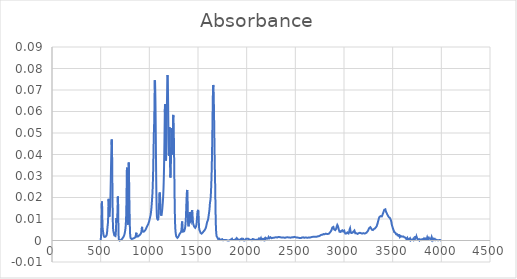
| Category | Absorbance |
|---|---|
| 3997.70514 | 0 |
| 3995.77668 | 0 |
| 3993.84822 | 0 |
| 3991.91975 | 0 |
| 3989.99129 | 0 |
| 3988.06283 | 0 |
| 3986.13436 | 0 |
| 3984.2059 | 0 |
| 3982.27743 | 0 |
| 3980.34897 | 0 |
| 3978.42051 | 0 |
| 3976.49204 | 0 |
| 3974.56358 | 0 |
| 3972.63512 | 0 |
| 3970.70665 | 0 |
| 3968.77819 | 0 |
| 3966.84973 | 0 |
| 3964.92126 | 0 |
| 3962.9928 | 0 |
| 3961.06433 | 0 |
| 3959.13587 | 0 |
| 3957.20741 | 0 |
| 3955.27894 | 0 |
| 3953.35048 | 0 |
| 3951.42202 | 0 |
| 3949.49355 | 0 |
| 3947.56509 | 0 |
| 3945.63663 | 0 |
| 3943.70816 | 0 |
| 3941.7797 | 0 |
| 3939.85123 | 0 |
| 3937.92277 | 0 |
| 3935.99431 | 0 |
| 3934.06584 | 0.001 |
| 3932.13738 | 0.001 |
| 3930.20892 | 0.001 |
| 3928.28045 | 0.001 |
| 3926.35199 | 0.001 |
| 3924.42353 | 0.001 |
| 3922.49506 | 0.001 |
| 3920.5666 | 0.001 |
| 3918.63813 | 0.001 |
| 3916.70967 | 0.001 |
| 3914.78121 | 0.001 |
| 3912.85274 | 0 |
| 3910.92428 | 0 |
| 3908.99582 | 0 |
| 3907.06735 | 0 |
| 3905.13889 | 0.001 |
| 3903.21043 | 0.002 |
| 3901.28196 | 0.002 |
| 3899.3535 | 0.001 |
| 3897.42503 | 0.001 |
| 3895.49657 | 0 |
| 3893.56811 | 0 |
| 3891.63964 | 0.001 |
| 3889.71118 | 0.001 |
| 3887.78272 | 0.001 |
| 3885.85425 | 0.001 |
| 3883.92579 | 0.001 |
| 3881.99733 | 0.001 |
| 3880.06886 | 0.001 |
| 3878.1404 | 0.001 |
| 3876.21193 | 0.001 |
| 3874.28347 | 0.001 |
| 3872.35501 | 0.001 |
| 3870.42654 | 0.001 |
| 3868.49808 | 0.001 |
| 3866.56962 | 0.001 |
| 3864.64115 | 0.001 |
| 3862.71269 | 0.001 |
| 3860.78422 | 0.001 |
| 3858.85576 | 0 |
| 3856.9273 | 0.001 |
| 3854.99883 | 0.001 |
| 3853.07037 | 0.002 |
| 3851.14191 | 0.001 |
| 3849.21344 | 0.001 |
| 3847.28498 | 0 |
| 3845.35652 | 0 |
| 3843.42805 | 0.001 |
| 3841.49959 | 0.001 |
| 3839.57112 | 0.001 |
| 3837.64266 | 0.001 |
| 3835.7142 | 0.001 |
| 3833.78573 | 0.001 |
| 3831.85727 | 0.001 |
| 3829.92881 | 0 |
| 3828.00034 | 0 |
| 3826.07188 | 0.001 |
| 3824.14342 | 0.001 |
| 3822.21495 | 0.001 |
| 3820.28649 | 0.001 |
| 3818.35802 | 0.001 |
| 3816.42956 | 0.001 |
| 3814.5011 | 0 |
| 3812.57263 | 0 |
| 3810.64417 | 0 |
| 3808.71571 | 0 |
| 3806.78724 | 0 |
| 3804.85878 | 0 |
| 3802.93032 | 0.001 |
| 3801.00185 | 0.001 |
| 3799.07339 | 0.001 |
| 3797.14492 | 0.001 |
| 3795.21646 | 0.001 |
| 3793.288 | 0 |
| 3791.35953 | 0 |
| 3789.43107 | 0 |
| 3787.50261 | 0 |
| 3785.57414 | 0 |
| 3783.64568 | 0 |
| 3781.71722 | 0 |
| 3779.78875 | 0.001 |
| 3777.86029 | 0 |
| 3775.93182 | 0 |
| 3774.00336 | 0 |
| 3772.0749 | 0 |
| 3770.14643 | 0 |
| 3768.21797 | 0 |
| 3766.28951 | 0.001 |
| 3764.36104 | 0 |
| 3762.43258 | 0 |
| 3760.50412 | 0.001 |
| 3758.57565 | 0.001 |
| 3756.64719 | 0.001 |
| 3754.71872 | 0.001 |
| 3752.79026 | 0.001 |
| 3750.8618 | 0.001 |
| 3748.93333 | 0.001 |
| 3747.00487 | 0.002 |
| 3745.07641 | 0.002 |
| 3743.14794 | 0.002 |
| 3741.21948 | 0.001 |
| 3739.29102 | 0.001 |
| 3737.36255 | 0.001 |
| 3735.43409 | 0.002 |
| 3733.50562 | 0.002 |
| 3731.57716 | 0.001 |
| 3729.6487 | 0.001 |
| 3727.72023 | 0.001 |
| 3725.79177 | 0.001 |
| 3723.86331 | 0.001 |
| 3721.93484 | 0.001 |
| 3720.00638 | 0 |
| 3718.07791 | 0 |
| 3716.14945 | 0 |
| 3714.22099 | 0 |
| 3712.29252 | 0.001 |
| 3710.36406 | 0.001 |
| 3708.4356 | 0.001 |
| 3706.50713 | 0 |
| 3704.57867 | 0 |
| 3702.65021 | 0 |
| 3700.72174 | 0.001 |
| 3698.79328 | 0 |
| 3696.86481 | 0 |
| 3694.93635 | 0 |
| 3693.00789 | 0.001 |
| 3691.07942 | 0.001 |
| 3689.15096 | 0.001 |
| 3687.2225 | 0.001 |
| 3685.29403 | 0 |
| 3683.36557 | 0 |
| 3681.43711 | 0 |
| 3679.50864 | 0.001 |
| 3677.58018 | 0.001 |
| 3675.65171 | 0.001 |
| 3673.72325 | 0.001 |
| 3671.79479 | 0.001 |
| 3669.86632 | 0.001 |
| 3667.93786 | 0.001 |
| 3666.0094 | 0.001 |
| 3664.08093 | 0 |
| 3662.15247 | 0 |
| 3660.22401 | 0 |
| 3658.29554 | 0 |
| 3656.36708 | 0 |
| 3654.43861 | 0 |
| 3652.51015 | 0.001 |
| 3650.58169 | 0.001 |
| 3648.65322 | 0.002 |
| 3646.72476 | 0.001 |
| 3644.7963 | 0.001 |
| 3642.86783 | 0.001 |
| 3640.93937 | 0.001 |
| 3639.01091 | 0 |
| 3637.08244 | 0 |
| 3635.15398 | 0.001 |
| 3633.22551 | 0.001 |
| 3631.29705 | 0.001 |
| 3629.36859 | 0.002 |
| 3627.44012 | 0.002 |
| 3625.51166 | 0.001 |
| 3623.5832 | 0.001 |
| 3621.65473 | 0.001 |
| 3619.72627 | 0.002 |
| 3617.79781 | 0.002 |
| 3615.86934 | 0.002 |
| 3613.94088 | 0.002 |
| 3612.01241 | 0.002 |
| 3610.08395 | 0.002 |
| 3608.15549 | 0.002 |
| 3606.22702 | 0.002 |
| 3604.29856 | 0.002 |
| 3602.3701 | 0.002 |
| 3600.44163 | 0.002 |
| 3598.51317 | 0.002 |
| 3596.58471 | 0.002 |
| 3594.65624 | 0.002 |
| 3592.72778 | 0.002 |
| 3590.79931 | 0.002 |
| 3588.87085 | 0.002 |
| 3586.94239 | 0.002 |
| 3585.01392 | 0.002 |
| 3583.08546 | 0.002 |
| 3581.157 | 0.002 |
| 3579.22853 | 0.002 |
| 3577.30007 | 0.002 |
| 3575.3716 | 0.002 |
| 3573.44314 | 0.002 |
| 3571.51468 | 0.002 |
| 3569.58621 | 0.002 |
| 3567.65775 | 0.003 |
| 3565.72929 | 0.003 |
| 3563.80082 | 0.003 |
| 3561.87236 | 0.002 |
| 3559.9439 | 0.002 |
| 3558.01543 | 0.002 |
| 3556.08697 | 0.002 |
| 3554.1585 | 0.002 |
| 3552.23004 | 0.002 |
| 3550.30158 | 0.002 |
| 3548.37311 | 0.003 |
| 3546.44465 | 0.003 |
| 3544.51619 | 0.003 |
| 3542.58772 | 0.003 |
| 3540.65926 | 0.003 |
| 3538.7308 | 0.003 |
| 3536.80233 | 0.003 |
| 3534.87387 | 0.003 |
| 3532.9454 | 0.003 |
| 3531.01694 | 0.003 |
| 3529.08848 | 0.003 |
| 3527.16001 | 0.004 |
| 3525.23155 | 0.004 |
| 3523.30309 | 0.004 |
| 3521.37462 | 0.004 |
| 3519.44616 | 0.004 |
| 3517.5177 | 0.004 |
| 3515.58923 | 0.004 |
| 3513.66077 | 0.004 |
| 3511.7323 | 0.005 |
| 3509.80384 | 0.005 |
| 3507.87538 | 0.005 |
| 3505.94691 | 0.005 |
| 3504.01845 | 0.005 |
| 3502.08999 | 0.006 |
| 3500.16152 | 0.006 |
| 3498.23306 | 0.006 |
| 3496.3046 | 0.007 |
| 3494.37613 | 0.007 |
| 3492.44767 | 0.007 |
| 3490.5192 | 0.008 |
| 3488.59074 | 0.008 |
| 3486.66228 | 0.009 |
| 3484.73381 | 0.009 |
| 3482.80535 | 0.009 |
| 3480.87689 | 0.01 |
| 3478.94842 | 0.01 |
| 3477.01996 | 0.01 |
| 3475.0915 | 0.01 |
| 3473.16303 | 0.01 |
| 3471.23457 | 0.011 |
| 3469.3061 | 0.011 |
| 3467.37764 | 0.011 |
| 3465.44918 | 0.011 |
| 3463.52071 | 0.011 |
| 3461.59225 | 0.011 |
| 3459.66379 | 0.011 |
| 3457.73532 | 0.011 |
| 3455.80686 | 0.011 |
| 3453.8784 | 0.011 |
| 3451.94993 | 0.011 |
| 3450.02147 | 0.012 |
| 3448.093 | 0.012 |
| 3446.16454 | 0.012 |
| 3444.23608 | 0.012 |
| 3442.30761 | 0.012 |
| 3440.37915 | 0.013 |
| 3438.45069 | 0.013 |
| 3436.52222 | 0.013 |
| 3434.59376 | 0.013 |
| 3432.66529 | 0.013 |
| 3430.73683 | 0.014 |
| 3428.80837 | 0.014 |
| 3426.8799 | 0.014 |
| 3424.95144 | 0.015 |
| 3423.02298 | 0.015 |
| 3421.09451 | 0.015 |
| 3419.16605 | 0.015 |
| 3417.23759 | 0.015 |
| 3415.30912 | 0.014 |
| 3413.38066 | 0.014 |
| 3411.45219 | 0.014 |
| 3409.52373 | 0.014 |
| 3407.59527 | 0.013 |
| 3405.6668 | 0.013 |
| 3403.73834 | 0.013 |
| 3401.80988 | 0.013 |
| 3399.88141 | 0.012 |
| 3397.95295 | 0.012 |
| 3396.02449 | 0.012 |
| 3394.09602 | 0.012 |
| 3392.16756 | 0.012 |
| 3390.23909 | 0.011 |
| 3388.31063 | 0.011 |
| 3386.38217 | 0.011 |
| 3384.4537 | 0.011 |
| 3382.52524 | 0.011 |
| 3380.59678 | 0.011 |
| 3378.66831 | 0.011 |
| 3376.73985 | 0.011 |
| 3374.81139 | 0.011 |
| 3372.88292 | 0.011 |
| 3370.95446 | 0.011 |
| 3369.02599 | 0.011 |
| 3367.09753 | 0.011 |
| 3365.16907 | 0.011 |
| 3363.2406 | 0.011 |
| 3361.31214 | 0.011 |
| 3359.38368 | 0.011 |
| 3357.45521 | 0.01 |
| 3355.52675 | 0.01 |
| 3353.59829 | 0.009 |
| 3351.66982 | 0.009 |
| 3349.74136 | 0.009 |
| 3347.81289 | 0.008 |
| 3345.88443 | 0.008 |
| 3343.95597 | 0.008 |
| 3342.0275 | 0.008 |
| 3340.09904 | 0.007 |
| 3338.17058 | 0.007 |
| 3336.24211 | 0.007 |
| 3334.31365 | 0.007 |
| 3332.38519 | 0.006 |
| 3330.45672 | 0.006 |
| 3328.52826 | 0.006 |
| 3326.59979 | 0.006 |
| 3324.67133 | 0.006 |
| 3322.74287 | 0.006 |
| 3320.8144 | 0.006 |
| 3318.88594 | 0.006 |
| 3316.95748 | 0.006 |
| 3315.02901 | 0.006 |
| 3313.10055 | 0.006 |
| 3311.17208 | 0.006 |
| 3309.24362 | 0.006 |
| 3307.31516 | 0.005 |
| 3305.38669 | 0.005 |
| 3303.45823 | 0.005 |
| 3301.52977 | 0.005 |
| 3299.6013 | 0.005 |
| 3297.67284 | 0.005 |
| 3295.74438 | 0.005 |
| 3293.81591 | 0.005 |
| 3291.88745 | 0.005 |
| 3289.95898 | 0.005 |
| 3288.03052 | 0.005 |
| 3286.10206 | 0.005 |
| 3284.17359 | 0.005 |
| 3282.24513 | 0.005 |
| 3280.31667 | 0.006 |
| 3278.3882 | 0.006 |
| 3276.45974 | 0.006 |
| 3274.53128 | 0.006 |
| 3272.60281 | 0.006 |
| 3270.67435 | 0.006 |
| 3268.74588 | 0.006 |
| 3266.81742 | 0.006 |
| 3264.88896 | 0.006 |
| 3262.96049 | 0.006 |
| 3261.03203 | 0.006 |
| 3259.10357 | 0.006 |
| 3257.1751 | 0.006 |
| 3255.24664 | 0.005 |
| 3253.31818 | 0.005 |
| 3251.38971 | 0.005 |
| 3249.46125 | 0.005 |
| 3247.53278 | 0.005 |
| 3245.60432 | 0.004 |
| 3243.67586 | 0.004 |
| 3241.74739 | 0.004 |
| 3239.81893 | 0.004 |
| 3237.89047 | 0.004 |
| 3235.962 | 0.004 |
| 3234.03354 | 0.004 |
| 3232.10508 | 0.004 |
| 3230.17661 | 0.004 |
| 3228.24815 | 0.004 |
| 3226.31968 | 0.004 |
| 3224.39122 | 0.003 |
| 3222.46276 | 0.003 |
| 3220.53429 | 0.003 |
| 3218.60583 | 0.003 |
| 3216.67737 | 0.003 |
| 3214.7489 | 0.003 |
| 3212.82044 | 0.003 |
| 3210.89198 | 0.003 |
| 3208.96351 | 0.003 |
| 3207.03505 | 0.003 |
| 3205.10658 | 0.003 |
| 3203.17812 | 0.003 |
| 3201.24966 | 0.003 |
| 3199.32119 | 0.003 |
| 3197.39273 | 0.003 |
| 3195.46427 | 0.003 |
| 3193.5358 | 0.003 |
| 3191.60734 | 0.003 |
| 3189.67888 | 0.003 |
| 3187.75041 | 0.003 |
| 3185.82195 | 0.003 |
| 3183.89348 | 0.003 |
| 3181.96502 | 0.003 |
| 3180.03656 | 0.003 |
| 3178.10809 | 0.003 |
| 3176.17963 | 0.003 |
| 3174.25117 | 0.003 |
| 3172.3227 | 0.004 |
| 3170.39424 | 0.004 |
| 3168.46577 | 0.004 |
| 3166.53731 | 0.004 |
| 3164.60885 | 0.004 |
| 3162.68038 | 0.004 |
| 3160.75192 | 0.003 |
| 3158.82346 | 0.003 |
| 3156.89499 | 0.003 |
| 3154.96653 | 0.003 |
| 3153.03807 | 0.003 |
| 3151.1096 | 0.003 |
| 3149.18114 | 0.003 |
| 3147.25267 | 0.003 |
| 3145.32421 | 0.003 |
| 3143.39575 | 0.003 |
| 3141.46728 | 0.003 |
| 3139.53882 | 0.003 |
| 3137.61036 | 0.003 |
| 3135.68189 | 0.003 |
| 3133.75343 | 0.003 |
| 3131.82497 | 0.003 |
| 3129.8965 | 0.003 |
| 3127.96804 | 0.003 |
| 3126.03957 | 0.004 |
| 3124.11111 | 0.003 |
| 3122.18265 | 0.003 |
| 3120.25418 | 0.003 |
| 3118.32572 | 0.003 |
| 3116.39726 | 0.003 |
| 3114.46879 | 0.003 |
| 3112.54033 | 0.004 |
| 3110.61187 | 0.004 |
| 3108.6834 | 0.004 |
| 3106.75494 | 0.005 |
| 3104.82647 | 0.005 |
| 3102.89801 | 0.005 |
| 3100.96955 | 0.005 |
| 3099.04108 | 0.004 |
| 3097.11262 | 0.004 |
| 3095.18416 | 0.004 |
| 3093.25569 | 0.004 |
| 3091.32723 | 0.004 |
| 3089.39877 | 0.004 |
| 3087.4703 | 0.004 |
| 3085.54184 | 0.004 |
| 3083.61337 | 0.003 |
| 3081.68491 | 0.003 |
| 3079.75645 | 0.003 |
| 3077.82798 | 0.003 |
| 3075.89952 | 0.003 |
| 3073.97106 | 0.003 |
| 3072.04259 | 0.004 |
| 3070.11413 | 0.004 |
| 3068.18567 | 0.004 |
| 3066.2572 | 0.005 |
| 3064.32874 | 0.005 |
| 3062.40027 | 0.006 |
| 3060.47181 | 0.006 |
| 3058.54335 | 0.006 |
| 3056.61488 | 0.005 |
| 3054.68642 | 0.004 |
| 3052.75796 | 0.004 |
| 3050.82949 | 0.004 |
| 3048.90103 | 0.003 |
| 3046.97257 | 0.003 |
| 3045.0441 | 0.003 |
| 3043.11564 | 0.003 |
| 3041.18717 | 0.003 |
| 3039.25871 | 0.003 |
| 3037.33025 | 0.004 |
| 3035.40178 | 0.004 |
| 3033.47332 | 0.004 |
| 3031.54486 | 0.004 |
| 3029.61639 | 0.004 |
| 3027.68793 | 0.003 |
| 3025.75946 | 0.003 |
| 3023.831 | 0.003 |
| 3021.90254 | 0.003 |
| 3019.97407 | 0.003 |
| 3018.04561 | 0.003 |
| 3016.11715 | 0.003 |
| 3014.18868 | 0.003 |
| 3012.26022 | 0.003 |
| 3010.33176 | 0.003 |
| 3008.40329 | 0.003 |
| 3006.47483 | 0.004 |
| 3004.54636 | 0.004 |
| 3002.6179 | 0.005 |
| 3000.68944 | 0.005 |
| 2998.76097 | 0.005 |
| 2996.83251 | 0.005 |
| 2994.90405 | 0.005 |
| 2992.97558 | 0.004 |
| 2991.04712 | 0.004 |
| 2989.11866 | 0.004 |
| 2987.19019 | 0.004 |
| 2985.26173 | 0.005 |
| 2983.33326 | 0.005 |
| 2981.4048 | 0.005 |
| 2979.47634 | 0.005 |
| 2977.54787 | 0.005 |
| 2975.61941 | 0.005 |
| 2973.69095 | 0.005 |
| 2971.76248 | 0.004 |
| 2969.83402 | 0.004 |
| 2967.90556 | 0.004 |
| 2965.97709 | 0.004 |
| 2964.04863 | 0.004 |
| 2962.12016 | 0.004 |
| 2960.1917 | 0.004 |
| 2958.26324 | 0.004 |
| 2956.33477 | 0.004 |
| 2954.40631 | 0.004 |
| 2952.47785 | 0.004 |
| 2950.54938 | 0.004 |
| 2948.62092 | 0.005 |
| 2946.69246 | 0.005 |
| 2944.76399 | 0.005 |
| 2942.83553 | 0.006 |
| 2940.90706 | 0.006 |
| 2938.9786 | 0.006 |
| 2937.05014 | 0.007 |
| 2935.12167 | 0.007 |
| 2933.19321 | 0.007 |
| 2931.26475 | 0.007 |
| 2929.33628 | 0.007 |
| 2927.40782 | 0.007 |
| 2925.47936 | 0.007 |
| 2923.55089 | 0.006 |
| 2921.62243 | 0.006 |
| 2919.69396 | 0.006 |
| 2917.7655 | 0.005 |
| 2915.83704 | 0.005 |
| 2913.90857 | 0.005 |
| 2911.98011 | 0.005 |
| 2910.05165 | 0.005 |
| 2908.12318 | 0.005 |
| 2906.19472 | 0.005 |
| 2904.26626 | 0.005 |
| 2902.33779 | 0.005 |
| 2900.40933 | 0.005 |
| 2898.48086 | 0.005 |
| 2896.5524 | 0.005 |
| 2894.62394 | 0.006 |
| 2892.69547 | 0.006 |
| 2890.76701 | 0.006 |
| 2888.83855 | 0.006 |
| 2886.91008 | 0.007 |
| 2884.98162 | 0.007 |
| 2883.05315 | 0.007 |
| 2881.12469 | 0.006 |
| 2879.19623 | 0.006 |
| 2877.26776 | 0.006 |
| 2875.3393 | 0.005 |
| 2873.41084 | 0.005 |
| 2871.48237 | 0.005 |
| 2869.55391 | 0.005 |
| 2867.62545 | 0.004 |
| 2865.69698 | 0.004 |
| 2863.76852 | 0.004 |
| 2861.84005 | 0.004 |
| 2859.91159 | 0.004 |
| 2857.98313 | 0.004 |
| 2856.05466 | 0.004 |
| 2854.1262 | 0.004 |
| 2852.19774 | 0.004 |
| 2850.26927 | 0.003 |
| 2848.34081 | 0.003 |
| 2846.41235 | 0.003 |
| 2844.48388 | 0.003 |
| 2842.55542 | 0.003 |
| 2840.62695 | 0.003 |
| 2838.69849 | 0.003 |
| 2836.77003 | 0.003 |
| 2834.84156 | 0.003 |
| 2832.9131 | 0.003 |
| 2830.98464 | 0.003 |
| 2829.05617 | 0.003 |
| 2827.12771 | 0.003 |
| 2825.19925 | 0.003 |
| 2823.27078 | 0.003 |
| 2821.34232 | 0.003 |
| 2819.41385 | 0.003 |
| 2817.48539 | 0.003 |
| 2815.55693 | 0.003 |
| 2813.62846 | 0.003 |
| 2811.7 | 0.003 |
| 2809.77154 | 0.003 |
| 2807.84307 | 0.003 |
| 2805.91461 | 0.003 |
| 2803.98615 | 0.003 |
| 2802.05768 | 0.003 |
| 2800.12922 | 0.003 |
| 2798.20075 | 0.003 |
| 2796.27229 | 0.003 |
| 2794.34383 | 0.003 |
| 2792.41536 | 0.003 |
| 2790.4869 | 0.003 |
| 2788.55844 | 0.003 |
| 2786.62997 | 0.003 |
| 2784.70151 | 0.003 |
| 2782.77305 | 0.003 |
| 2780.84458 | 0.003 |
| 2778.91612 | 0.003 |
| 2776.98765 | 0.003 |
| 2775.05919 | 0.003 |
| 2773.13073 | 0.003 |
| 2771.20226 | 0.003 |
| 2769.2738 | 0.003 |
| 2767.34534 | 0.003 |
| 2765.41687 | 0.003 |
| 2763.48841 | 0.003 |
| 2761.55995 | 0.003 |
| 2759.63148 | 0.002 |
| 2757.70302 | 0.002 |
| 2755.77455 | 0.002 |
| 2753.84609 | 0.002 |
| 2751.91763 | 0.002 |
| 2749.98916 | 0.002 |
| 2748.0607 | 0.002 |
| 2746.13224 | 0.002 |
| 2744.20377 | 0.002 |
| 2742.27531 | 0.002 |
| 2740.34684 | 0.002 |
| 2738.41838 | 0.002 |
| 2736.48992 | 0.002 |
| 2734.56145 | 0.002 |
| 2732.63299 | 0.002 |
| 2730.70453 | 0.002 |
| 2728.77606 | 0.002 |
| 2726.8476 | 0.002 |
| 2724.91914 | 0.002 |
| 2722.99067 | 0.002 |
| 2721.06221 | 0.002 |
| 2719.13374 | 0.002 |
| 2717.20528 | 0.002 |
| 2715.27682 | 0.002 |
| 2713.34835 | 0.002 |
| 2711.41989 | 0.002 |
| 2709.49143 | 0.002 |
| 2707.56296 | 0.002 |
| 2705.6345 | 0.002 |
| 2703.70604 | 0.002 |
| 2701.77757 | 0.002 |
| 2699.84911 | 0.002 |
| 2697.92064 | 0.002 |
| 2695.99218 | 0.002 |
| 2694.06372 | 0.002 |
| 2692.13525 | 0.002 |
| 2690.20679 | 0.002 |
| 2688.27833 | 0.002 |
| 2686.34986 | 0.002 |
| 2684.4214 | 0.002 |
| 2682.49294 | 0.002 |
| 2680.56447 | 0.002 |
| 2678.63601 | 0.002 |
| 2676.70754 | 0.002 |
| 2674.77908 | 0.002 |
| 2672.85062 | 0.002 |
| 2670.92215 | 0.002 |
| 2668.99369 | 0.002 |
| 2667.06523 | 0.002 |
| 2665.13676 | 0.002 |
| 2663.2083 | 0.002 |
| 2661.27984 | 0.002 |
| 2659.35137 | 0.001 |
| 2657.42291 | 0.001 |
| 2655.49444 | 0.001 |
| 2653.56598 | 0.001 |
| 2651.63752 | 0.001 |
| 2649.70905 | 0.001 |
| 2647.78059 | 0.001 |
| 2645.85213 | 0.001 |
| 2643.92366 | 0.002 |
| 2641.9952 | 0.002 |
| 2640.06674 | 0.001 |
| 2638.13827 | 0.001 |
| 2636.20981 | 0.001 |
| 2634.28134 | 0.001 |
| 2632.35288 | 0.001 |
| 2630.42442 | 0.001 |
| 2628.49595 | 0.001 |
| 2626.56749 | 0.001 |
| 2624.63903 | 0.001 |
| 2622.71056 | 0.001 |
| 2620.7821 | 0.001 |
| 2618.85364 | 0.001 |
| 2616.92517 | 0.001 |
| 2614.99671 | 0.001 |
| 2613.06824 | 0.001 |
| 2611.13978 | 0.001 |
| 2609.21132 | 0.001 |
| 2607.28285 | 0.001 |
| 2605.35439 | 0.001 |
| 2603.42593 | 0.001 |
| 2601.49746 | 0.001 |
| 2599.569 | 0.001 |
| 2597.64053 | 0.001 |
| 2595.71207 | 0.001 |
| 2593.78361 | 0.001 |
| 2591.85514 | 0.001 |
| 2589.92668 | 0.001 |
| 2587.99822 | 0.001 |
| 2586.06975 | 0.001 |
| 2584.14129 | 0.001 |
| 2582.21283 | 0.001 |
| 2580.28436 | 0.001 |
| 2578.3559 | 0.002 |
| 2576.42743 | 0.002 |
| 2574.49897 | 0.001 |
| 2572.57051 | 0.001 |
| 2570.64204 | 0.001 |
| 2568.71358 | 0.001 |
| 2566.78512 | 0.001 |
| 2564.85665 | 0.001 |
| 2562.92819 | 0.001 |
| 2560.99973 | 0.001 |
| 2559.07126 | 0.001 |
| 2557.1428 | 0.001 |
| 2555.21433 | 0.001 |
| 2553.28587 | 0.001 |
| 2551.35741 | 0.001 |
| 2549.42894 | 0.001 |
| 2547.50048 | 0.001 |
| 2545.57202 | 0.001 |
| 2543.64355 | 0.001 |
| 2541.71509 | 0.001 |
| 2539.78663 | 0.001 |
| 2537.85816 | 0.001 |
| 2535.9297 | 0.001 |
| 2534.00123 | 0.001 |
| 2532.07277 | 0.001 |
| 2530.14431 | 0.001 |
| 2528.21584 | 0.002 |
| 2526.28738 | 0.002 |
| 2524.35892 | 0.001 |
| 2522.43045 | 0.001 |
| 2520.50199 | 0.001 |
| 2518.57353 | 0.001 |
| 2516.64506 | 0.001 |
| 2514.7166 | 0.001 |
| 2512.78813 | 0.001 |
| 2510.85967 | 0.001 |
| 2508.93121 | 0.002 |
| 2507.00274 | 0.002 |
| 2505.07428 | 0.002 |
| 2503.14582 | 0.002 |
| 2501.21735 | 0.002 |
| 2499.28889 | 0.002 |
| 2497.36043 | 0.002 |
| 2495.43196 | 0.002 |
| 2493.5035 | 0.002 |
| 2491.57503 | 0.002 |
| 2489.64657 | 0.002 |
| 2487.71811 | 0.002 |
| 2485.78964 | 0.002 |
| 2483.86118 | 0.002 |
| 2481.93272 | 0.002 |
| 2480.00425 | 0.001 |
| 2478.07579 | 0.001 |
| 2476.14733 | 0.001 |
| 2474.21886 | 0.002 |
| 2472.2904 | 0.002 |
| 2470.36193 | 0.002 |
| 2468.43347 | 0.002 |
| 2466.50501 | 0.001 |
| 2464.57654 | 0.001 |
| 2462.64808 | 0.001 |
| 2460.71962 | 0.001 |
| 2458.79115 | 0.001 |
| 2456.86269 | 0.001 |
| 2454.93422 | 0.001 |
| 2453.00576 | 0.001 |
| 2451.0773 | 0.001 |
| 2449.14883 | 0.001 |
| 2447.22037 | 0.002 |
| 2445.29191 | 0.001 |
| 2443.36344 | 0.001 |
| 2441.43498 | 0.001 |
| 2439.50652 | 0.001 |
| 2437.57805 | 0.001 |
| 2435.64959 | 0.001 |
| 2433.72112 | 0.001 |
| 2431.79266 | 0.001 |
| 2429.8642 | 0.001 |
| 2427.93573 | 0.001 |
| 2426.00727 | 0.001 |
| 2424.07881 | 0.001 |
| 2422.15034 | 0.001 |
| 2420.22188 | 0.001 |
| 2418.29342 | 0.001 |
| 2416.36495 | 0.001 |
| 2414.43649 | 0.001 |
| 2412.50802 | 0.001 |
| 2410.57956 | 0.002 |
| 2408.6511 | 0.002 |
| 2406.72263 | 0.001 |
| 2404.79417 | 0.001 |
| 2402.86571 | 0.001 |
| 2400.93724 | 0.001 |
| 2399.00878 | 0.001 |
| 2397.08032 | 0.001 |
| 2395.15185 | 0.001 |
| 2393.22339 | 0.001 |
| 2391.29492 | 0.001 |
| 2389.36646 | 0.001 |
| 2387.438 | 0.001 |
| 2385.50953 | 0.001 |
| 2383.58107 | 0.001 |
| 2381.65261 | 0.001 |
| 2379.72414 | 0.001 |
| 2377.79568 | 0.001 |
| 2375.86722 | 0.002 |
| 2373.93875 | 0.001 |
| 2372.01029 | 0.001 |
| 2370.08182 | 0.001 |
| 2368.15336 | 0.001 |
| 2366.2249 | 0.001 |
| 2364.29643 | 0.001 |
| 2362.36797 | 0.001 |
| 2360.43951 | 0.001 |
| 2358.51104 | 0.001 |
| 2356.58258 | 0.001 |
| 2354.65412 | 0.002 |
| 2352.72565 | 0.002 |
| 2350.79719 | 0.001 |
| 2348.86872 | 0.001 |
| 2346.94026 | 0.001 |
| 2345.0118 | 0.001 |
| 2343.08333 | 0.001 |
| 2341.15487 | 0.001 |
| 2339.22641 | 0.002 |
| 2337.29794 | 0.002 |
| 2335.36948 | 0.002 |
| 2333.44102 | 0.002 |
| 2331.51255 | 0.002 |
| 2329.58409 | 0.002 |
| 2327.65562 | 0.002 |
| 2325.72716 | 0.002 |
| 2323.7987 | 0.002 |
| 2321.87023 | 0.002 |
| 2319.94177 | 0.002 |
| 2318.01331 | 0.002 |
| 2316.08484 | 0.001 |
| 2314.15638 | 0.001 |
| 2312.22791 | 0.001 |
| 2310.29945 | 0.001 |
| 2308.37099 | 0.002 |
| 2306.44252 | 0.002 |
| 2304.51406 | 0.002 |
| 2302.5856 | 0.002 |
| 2300.65713 | 0.001 |
| 2298.72867 | 0.001 |
| 2296.80021 | 0.001 |
| 2294.87174 | 0.001 |
| 2292.94328 | 0.001 |
| 2291.01481 | 0.001 |
| 2289.08635 | 0.001 |
| 2287.15789 | 0.001 |
| 2285.22942 | 0.001 |
| 2283.30096 | 0.001 |
| 2281.3725 | 0.001 |
| 2279.44403 | 0.001 |
| 2277.51557 | 0.001 |
| 2275.58711 | 0.001 |
| 2273.65864 | 0.001 |
| 2271.73018 | 0.001 |
| 2269.80171 | 0.001 |
| 2267.87325 | 0.001 |
| 2265.94479 | 0.001 |
| 2264.01632 | 0.001 |
| 2262.08786 | 0.001 |
| 2260.1594 | 0.001 |
| 2258.23093 | 0.001 |
| 2256.30247 | 0.001 |
| 2254.37401 | 0.001 |
| 2252.44554 | 0.001 |
| 2250.51708 | 0.001 |
| 2248.58861 | 0.001 |
| 2246.66015 | 0.001 |
| 2244.73169 | 0.002 |
| 2242.80322 | 0.001 |
| 2240.87476 | 0.001 |
| 2238.9463 | 0.001 |
| 2237.01783 | 0.001 |
| 2235.08937 | 0.001 |
| 2233.16091 | 0.001 |
| 2231.23244 | 0.001 |
| 2229.30398 | 0.001 |
| 2227.37551 | 0.001 |
| 2225.44705 | 0.002 |
| 2223.51859 | 0.001 |
| 2221.59012 | 0.001 |
| 2219.66166 | 0.001 |
| 2217.7332 | 0.001 |
| 2215.80473 | 0.001 |
| 2213.87627 | 0.001 |
| 2211.94781 | 0.001 |
| 2210.01934 | 0.001 |
| 2208.09088 | 0.001 |
| 2206.16241 | 0.001 |
| 2204.23395 | 0.001 |
| 2202.30549 | 0.001 |
| 2200.37702 | 0.001 |
| 2198.44856 | 0.001 |
| 2196.5201 | 0.001 |
| 2194.59163 | 0.001 |
| 2192.66317 | 0.001 |
| 2190.73471 | 0.001 |
| 2188.80624 | 0.001 |
| 2186.87778 | 0.001 |
| 2184.94931 | 0.001 |
| 2183.02085 | 0.001 |
| 2181.09239 | 0.001 |
| 2179.16392 | 0.001 |
| 2177.23546 | 0.001 |
| 2175.307 | 0 |
| 2173.37853 | 0 |
| 2171.45007 | 0 |
| 2169.5216 | 0 |
| 2167.59314 | 0 |
| 2165.66468 | 0.001 |
| 2163.73621 | 0.001 |
| 2161.80775 | 0.001 |
| 2159.87929 | 0.001 |
| 2157.95082 | 0.001 |
| 2156.02236 | 0.001 |
| 2154.0939 | 0.001 |
| 2152.16543 | 0 |
| 2150.23697 | 0 |
| 2148.3085 | 0.001 |
| 2146.38004 | 0.001 |
| 2144.45158 | 0.001 |
| 2142.52311 | 0.001 |
| 2140.59465 | 0.001 |
| 2138.66619 | 0.001 |
| 2136.73772 | 0.001 |
| 2134.80926 | 0.001 |
| 2132.8808 | 0.001 |
| 2130.95233 | 0.001 |
| 2129.02387 | 0.001 |
| 2127.0954 | 0.001 |
| 2125.16694 | 0.001 |
| 2123.23848 | 0.001 |
| 2121.31001 | 0.001 |
| 2119.38155 | 0.001 |
| 2117.45309 | 0 |
| 2115.52462 | 0 |
| 2113.59616 | 0.001 |
| 2111.6677 | 0.001 |
| 2109.73923 | 0.001 |
| 2107.81077 | 0.001 |
| 2105.8823 | 0 |
| 2103.95384 | 0 |
| 2102.02538 | 0 |
| 2100.09691 | 0 |
| 2098.16845 | 0 |
| 2096.23999 | 0 |
| 2094.31152 | 0 |
| 2092.38306 | 0 |
| 2090.4546 | 0 |
| 2088.52613 | 0 |
| 2086.59767 | 0.001 |
| 2084.6692 | 0.001 |
| 2082.74074 | 0 |
| 2080.81228 | 0 |
| 2078.88381 | 0 |
| 2076.95535 | 0 |
| 2075.02689 | 0 |
| 2073.09842 | 0.001 |
| 2071.16996 | 0.001 |
| 2069.2415 | 0.001 |
| 2067.31303 | 0.001 |
| 2065.38457 | 0.001 |
| 2063.4561 | 0 |
| 2061.52764 | 0 |
| 2059.59918 | 0.001 |
| 2057.67071 | 0.001 |
| 2055.74225 | 0.001 |
| 2053.81379 | 0 |
| 2051.88532 | 0 |
| 2049.95686 | 0 |
| 2048.0284 | 0 |
| 2046.09993 | 0 |
| 2044.17147 | 0 |
| 2042.243 | 0 |
| 2040.31454 | 0 |
| 2038.38608 | 0 |
| 2036.45761 | 0 |
| 2034.52915 | 0 |
| 2032.60069 | 0 |
| 2030.67222 | 0 |
| 2028.74376 | 0 |
| 2026.81529 | 0.001 |
| 2024.88683 | 0.001 |
| 2022.95837 | 0.001 |
| 2021.0299 | 0.001 |
| 2019.10144 | 0.001 |
| 2017.17298 | 0.001 |
| 2015.24451 | 0.001 |
| 2013.31605 | 0.001 |
| 2011.38759 | 0.001 |
| 2009.45912 | 0.001 |
| 2007.53066 | 0.001 |
| 2005.60219 | 0.001 |
| 2003.67373 | 0.001 |
| 2001.74527 | 0.001 |
| 1999.8168 | 0.001 |
| 1997.88834 | 0.001 |
| 1995.95988 | 0.001 |
| 1994.03141 | 0.001 |
| 1992.10295 | 0.001 |
| 1990.17449 | 0.001 |
| 1988.24602 | 0.001 |
| 1986.31756 | 0 |
| 1984.38909 | 0 |
| 1982.46063 | 0 |
| 1980.53217 | 0 |
| 1978.6037 | 0 |
| 1976.67524 | 0 |
| 1974.74678 | 0 |
| 1972.81831 | 0 |
| 1970.88985 | 0 |
| 1968.96139 | 0 |
| 1967.03292 | 0.001 |
| 1965.10446 | 0.001 |
| 1963.17599 | 0.001 |
| 1961.24753 | 0 |
| 1959.31907 | 0 |
| 1957.3906 | 0 |
| 1955.46214 | 0 |
| 1953.53368 | 0.001 |
| 1951.60521 | 0.001 |
| 1949.67675 | 0.001 |
| 1947.74829 | 0.001 |
| 1945.81982 | 0.001 |
| 1943.89136 | 0.001 |
| 1941.96289 | 0.001 |
| 1940.03443 | 0.001 |
| 1938.10597 | 0.001 |
| 1936.1775 | 0.001 |
| 1934.24904 | 0.001 |
| 1932.32058 | 0.001 |
| 1930.39211 | 0 |
| 1928.46365 | 0 |
| 1926.53519 | 0 |
| 1924.60672 | 0 |
| 1922.67826 | 0 |
| 1920.74979 | 0.001 |
| 1918.82133 | 0.001 |
| 1916.89287 | 0 |
| 1914.9644 | 0 |
| 1913.03594 | 0 |
| 1911.10748 | 0 |
| 1909.17901 | 0 |
| 1907.25055 | 0.001 |
| 1905.32209 | 0.001 |
| 1903.39362 | 0.001 |
| 1901.46516 | 0.001 |
| 1899.53669 | 0.001 |
| 1897.60823 | 0.001 |
| 1895.67977 | 0.001 |
| 1893.7513 | 0.001 |
| 1891.82284 | 0.001 |
| 1889.89438 | 0.001 |
| 1887.96591 | 0.001 |
| 1886.03745 | 0 |
| 1884.10898 | 0 |
| 1882.18052 | 0 |
| 1880.25206 | 0 |
| 1878.32359 | 0 |
| 1876.39513 | 0 |
| 1874.46667 | 0 |
| 1872.5382 | 0 |
| 1870.60974 | 0 |
| 1868.68128 | 0 |
| 1866.75281 | 0 |
| 1864.82435 | 0 |
| 1862.89588 | 0 |
| 1860.96742 | 0 |
| 1859.03896 | 0 |
| 1857.11049 | 0 |
| 1855.18203 | 0 |
| 1853.25357 | 0 |
| 1851.3251 | 0.001 |
| 1849.39664 | 0.001 |
| 1847.46818 | 0.001 |
| 1845.53971 | 0.001 |
| 1843.61125 | 0.001 |
| 1841.68278 | 0.001 |
| 1839.75432 | 0.001 |
| 1837.82586 | 0 |
| 1835.89739 | 0 |
| 1833.96893 | 0 |
| 1832.04047 | 0 |
| 1830.112 | 0 |
| 1828.18354 | 0 |
| 1826.25508 | 0 |
| 1824.32661 | 0 |
| 1822.39815 | 0 |
| 1820.46968 | 0 |
| 1818.54122 | 0 |
| 1816.61276 | 0 |
| 1814.68429 | 0 |
| 1812.75583 | 0 |
| 1810.82737 | 0 |
| 1808.8989 | 0 |
| 1806.97044 | 0 |
| 1805.04198 | 0 |
| 1803.11351 | 0 |
| 1801.18505 | 0 |
| 1799.25658 | 0 |
| 1797.32812 | 0 |
| 1795.39966 | 0 |
| 1793.47119 | 0 |
| 1791.54273 | 0 |
| 1789.61427 | 0 |
| 1787.6858 | 0 |
| 1785.75734 | 0 |
| 1783.82888 | 0 |
| 1781.90041 | 0 |
| 1779.97195 | 0 |
| 1778.04348 | 0 |
| 1776.11502 | 0 |
| 1774.18656 | 0 |
| 1772.25809 | 0 |
| 1770.32963 | 0 |
| 1768.40117 | 0 |
| 1766.4727 | 0 |
| 1764.54424 | 0 |
| 1762.61578 | 0 |
| 1760.68731 | 0 |
| 1758.75885 | 0 |
| 1756.83038 | 0 |
| 1754.90192 | 0 |
| 1752.97346 | 0 |
| 1751.04499 | 0 |
| 1749.11653 | 0.001 |
| 1747.18807 | 0.001 |
| 1745.2596 | 0.001 |
| 1743.33114 | 0.001 |
| 1741.40267 | 0 |
| 1739.47421 | 0 |
| 1737.54575 | 0 |
| 1735.61728 | 0 |
| 1733.68882 | 0.001 |
| 1731.76036 | 0.001 |
| 1729.83189 | 0.001 |
| 1727.90343 | 0 |
| 1725.97497 | 0 |
| 1724.0465 | 0 |
| 1722.11804 | 0 |
| 1720.18957 | 0.001 |
| 1718.26111 | 0.001 |
| 1716.33265 | 0.001 |
| 1714.40418 | 0.001 |
| 1712.47572 | 0.001 |
| 1710.54726 | 0.001 |
| 1708.61879 | 0.001 |
| 1706.69033 | 0.001 |
| 1704.76187 | 0.001 |
| 1702.8334 | 0.001 |
| 1700.90494 | 0.001 |
| 1698.97647 | 0.001 |
| 1697.04801 | 0.001 |
| 1695.11955 | 0.001 |
| 1693.19108 | 0.002 |
| 1691.26262 | 0.002 |
| 1689.33416 | 0.003 |
| 1687.40569 | 0.004 |
| 1685.47723 | 0.005 |
| 1683.54877 | 0.007 |
| 1681.6203 | 0.011 |
| 1679.69184 | 0.016 |
| 1677.76337 | 0.021 |
| 1675.83491 | 0.027 |
| 1673.90645 | 0.032 |
| 1671.97798 | 0.036 |
| 1670.04952 | 0.042 |
| 1668.12106 | 0.048 |
| 1666.19259 | 0.054 |
| 1664.26413 | 0.06 |
| 1662.33567 | 0.066 |
| 1660.4072 | 0.069 |
| 1658.47874 | 0.072 |
| 1656.55027 | 0.072 |
| 1654.62181 | 0.071 |
| 1652.69335 | 0.067 |
| 1650.76488 | 0.061 |
| 1648.83642 | 0.055 |
| 1646.90796 | 0.049 |
| 1644.97949 | 0.043 |
| 1643.05103 | 0.038 |
| 1641.12257 | 0.034 |
| 1639.1941 | 0.03 |
| 1637.26564 | 0.027 |
| 1635.33717 | 0.025 |
| 1633.40871 | 0.023 |
| 1631.48025 | 0.021 |
| 1629.55178 | 0.02 |
| 1627.62332 | 0.019 |
| 1625.69486 | 0.018 |
| 1623.76639 | 0.018 |
| 1621.83793 | 0.017 |
| 1619.90946 | 0.016 |
| 1617.981 | 0.015 |
| 1616.05254 | 0.014 |
| 1614.12407 | 0.013 |
| 1612.19561 | 0.012 |
| 1610.26715 | 0.012 |
| 1608.33868 | 0.011 |
| 1606.41022 | 0.011 |
| 1604.48176 | 0.01 |
| 1602.55329 | 0.01 |
| 1600.62483 | 0.009 |
| 1598.69636 | 0.009 |
| 1596.7679 | 0.009 |
| 1594.83944 | 0.009 |
| 1592.91097 | 0.008 |
| 1590.98251 | 0.008 |
| 1589.05405 | 0.008 |
| 1587.12558 | 0.007 |
| 1585.19712 | 0.007 |
| 1583.26866 | 0.006 |
| 1581.34019 | 0.006 |
| 1579.41173 | 0.006 |
| 1577.48326 | 0.006 |
| 1575.5548 | 0.005 |
| 1573.62634 | 0.005 |
| 1571.69787 | 0.005 |
| 1569.76941 | 0.005 |
| 1567.84095 | 0.005 |
| 1565.91248 | 0.005 |
| 1563.98402 | 0.005 |
| 1562.05556 | 0.004 |
| 1560.12709 | 0.004 |
| 1558.19863 | 0.004 |
| 1556.27016 | 0.004 |
| 1554.3417 | 0.004 |
| 1552.41324 | 0.004 |
| 1550.48477 | 0.004 |
| 1548.55631 | 0.004 |
| 1546.62785 | 0.004 |
| 1544.69938 | 0.004 |
| 1542.77092 | 0.004 |
| 1540.84246 | 0.004 |
| 1538.91399 | 0.003 |
| 1536.98553 | 0.003 |
| 1535.05706 | 0.003 |
| 1533.1286 | 0.003 |
| 1531.20014 | 0.003 |
| 1529.27167 | 0.003 |
| 1527.34321 | 0.003 |
| 1525.41475 | 0.004 |
| 1523.48628 | 0.004 |
| 1521.55782 | 0.004 |
| 1519.62936 | 0.004 |
| 1517.70089 | 0.005 |
| 1515.77243 | 0.005 |
| 1513.84396 | 0.005 |
| 1511.9155 | 0.006 |
| 1509.98704 | 0.007 |
| 1508.05857 | 0.009 |
| 1506.13011 | 0.012 |
| 1504.20165 | 0.014 |
| 1502.27318 | 0.014 |
| 1500.34472 | 0.014 |
| 1498.41626 | 0.014 |
| 1496.48779 | 0.014 |
| 1494.55933 | 0.013 |
| 1492.63086 | 0.012 |
| 1490.7024 | 0.011 |
| 1488.77394 | 0.01 |
| 1486.84547 | 0.009 |
| 1484.91701 | 0.008 |
| 1482.98855 | 0.007 |
| 1481.06008 | 0.007 |
| 1479.13162 | 0.006 |
| 1477.20315 | 0.006 |
| 1475.27469 | 0.006 |
| 1473.34623 | 0.006 |
| 1471.41776 | 0.006 |
| 1469.4893 | 0.006 |
| 1467.56084 | 0.006 |
| 1465.63237 | 0.006 |
| 1463.70391 | 0.006 |
| 1461.77545 | 0.006 |
| 1459.84698 | 0.007 |
| 1457.91852 | 0.007 |
| 1455.99005 | 0.007 |
| 1454.06159 | 0.007 |
| 1452.13313 | 0.007 |
| 1450.20466 | 0.008 |
| 1448.2762 | 0.009 |
| 1446.34774 | 0.01 |
| 1444.41927 | 0.011 |
| 1442.49081 | 0.013 |
| 1440.56235 | 0.014 |
| 1438.63388 | 0.014 |
| 1436.70542 | 0.014 |
| 1434.77695 | 0.013 |
| 1432.84849 | 0.012 |
| 1430.92003 | 0.011 |
| 1428.99156 | 0.009 |
| 1427.0631 | 0.009 |
| 1425.13464 | 0.008 |
| 1423.20617 | 0.008 |
| 1421.27771 | 0.009 |
| 1419.34925 | 0.01 |
| 1417.42078 | 0.012 |
| 1415.49232 | 0.013 |
| 1413.56385 | 0.013 |
| 1411.63539 | 0.013 |
| 1409.70693 | 0.011 |
| 1407.77846 | 0.009 |
| 1405.85 | 0.007 |
| 1403.92154 | 0.007 |
| 1401.99307 | 0.006 |
| 1400.06461 | 0.007 |
| 1398.13615 | 0.009 |
| 1396.20768 | 0.012 |
| 1394.27922 | 0.016 |
| 1392.35075 | 0.021 |
| 1390.42229 | 0.023 |
| 1388.49383 | 0.024 |
| 1386.56536 | 0.023 |
| 1384.6369 | 0.022 |
| 1382.70844 | 0.02 |
| 1380.77997 | 0.017 |
| 1378.85151 | 0.015 |
| 1376.92305 | 0.012 |
| 1374.99458 | 0.01 |
| 1373.06612 | 0.009 |
| 1371.13765 | 0.007 |
| 1369.20919 | 0.007 |
| 1367.28073 | 0.006 |
| 1365.35226 | 0.005 |
| 1363.4238 | 0.005 |
| 1361.49534 | 0.005 |
| 1359.56687 | 0.004 |
| 1357.63841 | 0.004 |
| 1355.70995 | 0.004 |
| 1353.78148 | 0.004 |
| 1351.85302 | 0.004 |
| 1349.92455 | 0.004 |
| 1347.99609 | 0.004 |
| 1346.06763 | 0.004 |
| 1344.13916 | 0.004 |
| 1342.2107 | 0.005 |
| 1340.28224 | 0.007 |
| 1338.35377 | 0.009 |
| 1336.42531 | 0.009 |
| 1334.49684 | 0.008 |
| 1332.56838 | 0.006 |
| 1330.63992 | 0.005 |
| 1328.71145 | 0.005 |
| 1326.78299 | 0.004 |
| 1324.85453 | 0.004 |
| 1322.92606 | 0.004 |
| 1320.9976 | 0.004 |
| 1319.06914 | 0.003 |
| 1317.14067 | 0.003 |
| 1315.21221 | 0.003 |
| 1313.28374 | 0.003 |
| 1311.35528 | 0.003 |
| 1309.42682 | 0.003 |
| 1307.49835 | 0.003 |
| 1305.56989 | 0.002 |
| 1303.64143 | 0.002 |
| 1301.71296 | 0.002 |
| 1299.7845 | 0.002 |
| 1297.85604 | 0.002 |
| 1295.92757 | 0.002 |
| 1293.99911 | 0.001 |
| 1292.07064 | 0.001 |
| 1290.14218 | 0.001 |
| 1288.21372 | 0.001 |
| 1286.28525 | 0.001 |
| 1284.35679 | 0.001 |
| 1282.42833 | 0.001 |
| 1280.49986 | 0.001 |
| 1278.5714 | 0.002 |
| 1276.64294 | 0.002 |
| 1274.71447 | 0.002 |
| 1272.78601 | 0.003 |
| 1270.85754 | 0.003 |
| 1268.92908 | 0.004 |
| 1267.00062 | 0.006 |
| 1265.07215 | 0.008 |
| 1263.14369 | 0.011 |
| 1261.21523 | 0.015 |
| 1259.28676 | 0.021 |
| 1257.3583 | 0.028 |
| 1255.42984 | 0.036 |
| 1253.50137 | 0.043 |
| 1251.57291 | 0.05 |
| 1249.64444 | 0.055 |
| 1247.71598 | 0.058 |
| 1245.78752 | 0.058 |
| 1243.85905 | 0.057 |
| 1241.93059 | 0.052 |
| 1240.00213 | 0.046 |
| 1238.07366 | 0.041 |
| 1236.1452 | 0.04 |
| 1234.21674 | 0.044 |
| 1232.28827 | 0.05 |
| 1230.35981 | 0.052 |
| 1228.43134 | 0.052 |
| 1226.50288 | 0.049 |
| 1224.57442 | 0.044 |
| 1222.64595 | 0.039 |
| 1220.71749 | 0.034 |
| 1218.78903 | 0.031 |
| 1216.86056 | 0.029 |
| 1214.9321 | 0.031 |
| 1213.00364 | 0.036 |
| 1211.07517 | 0.043 |
| 1209.14671 | 0.051 |
| 1207.21824 | 0.053 |
| 1205.28978 | 0.049 |
| 1203.36132 | 0.043 |
| 1201.43285 | 0.039 |
| 1199.50439 | 0.041 |
| 1197.57593 | 0.046 |
| 1195.64746 | 0.053 |
| 1193.719 | 0.061 |
| 1191.79053 | 0.068 |
| 1189.86207 | 0.074 |
| 1187.93361 | 0.077 |
| 1186.00514 | 0.076 |
| 1184.07668 | 0.073 |
| 1182.14822 | 0.068 |
| 1180.21975 | 0.061 |
| 1178.29129 | 0.055 |
| 1176.36283 | 0.048 |
| 1174.43436 | 0.042 |
| 1172.5059 | 0.038 |
| 1170.57743 | 0.037 |
| 1168.64897 | 0.041 |
| 1166.72051 | 0.048 |
| 1164.79204 | 0.056 |
| 1162.86358 | 0.062 |
| 1160.93512 | 0.063 |
| 1159.00665 | 0.06 |
| 1157.07819 | 0.053 |
| 1155.14973 | 0.046 |
| 1153.22126 | 0.039 |
| 1151.2928 | 0.034 |
| 1149.36433 | 0.03 |
| 1147.43587 | 0.027 |
| 1145.50741 | 0.024 |
| 1143.57894 | 0.022 |
| 1141.65048 | 0.02 |
| 1139.72202 | 0.019 |
| 1137.79355 | 0.017 |
| 1135.86509 | 0.016 |
| 1133.93663 | 0.015 |
| 1132.00816 | 0.014 |
| 1130.0797 | 0.013 |
| 1128.15123 | 0.013 |
| 1126.22277 | 0.012 |
| 1124.29431 | 0.012 |
| 1122.36584 | 0.012 |
| 1120.43738 | 0.012 |
| 1118.50892 | 0.013 |
| 1116.58045 | 0.014 |
| 1114.65199 | 0.016 |
| 1112.72353 | 0.018 |
| 1110.79506 | 0.02 |
| 1108.8666 | 0.022 |
| 1106.93813 | 0.022 |
| 1105.00967 | 0.022 |
| 1103.08121 | 0.02 |
| 1101.15274 | 0.018 |
| 1099.22428 | 0.016 |
| 1097.29582 | 0.013 |
| 1095.36735 | 0.012 |
| 1093.43889 | 0.011 |
| 1091.51043 | 0.01 |
| 1089.58196 | 0.009 |
| 1087.6535 | 0.009 |
| 1085.72503 | 0.009 |
| 1083.79657 | 0.009 |
| 1081.86811 | 0.009 |
| 1079.93964 | 0.01 |
| 1078.01118 | 0.011 |
| 1076.08272 | 0.013 |
| 1074.15425 | 0.017 |
| 1072.22579 | 0.022 |
| 1070.29733 | 0.03 |
| 1068.36886 | 0.039 |
| 1066.4404 | 0.049 |
| 1064.51193 | 0.058 |
| 1062.58347 | 0.065 |
| 1060.65501 | 0.07 |
| 1058.72654 | 0.074 |
| 1056.79808 | 0.074 |
| 1054.86962 | 0.07 |
| 1052.94115 | 0.063 |
| 1051.01269 | 0.057 |
| 1049.08422 | 0.054 |
| 1047.15576 | 0.051 |
| 1045.2273 | 0.048 |
| 1043.29883 | 0.043 |
| 1041.37037 | 0.038 |
| 1039.44191 | 0.033 |
| 1037.51344 | 0.029 |
| 1035.58498 | 0.026 |
| 1033.65652 | 0.024 |
| 1031.72805 | 0.022 |
| 1029.79959 | 0.02 |
| 1027.87112 | 0.019 |
| 1025.94266 | 0.018 |
| 1024.0142 | 0.017 |
| 1022.08573 | 0.015 |
| 1020.15727 | 0.014 |
| 1018.22881 | 0.014 |
| 1016.30034 | 0.013 |
| 1014.37188 | 0.012 |
| 1012.44342 | 0.012 |
| 1010.51495 | 0.011 |
| 1008.58649 | 0.011 |
| 1006.65802 | 0.011 |
| 1004.72956 | 0.01 |
| 1002.8011 | 0.01 |
| 1000.87263 | 0.009 |
| 998.94417 | 0.009 |
| 997.01571 | 0.009 |
| 995.08724 | 0.008 |
| 993.15878 | 0.008 |
| 991.23032 | 0.008 |
| 989.30185 | 0.008 |
| 987.37339 | 0.008 |
| 985.44492 | 0.007 |
| 983.51646 | 0.007 |
| 981.588 | 0.007 |
| 979.65953 | 0.007 |
| 977.73107 | 0.007 |
| 975.80261 | 0.007 |
| 973.87414 | 0.006 |
| 971.94568 | 0.006 |
| 970.01722 | 0.006 |
| 968.08875 | 0.006 |
| 966.16029 | 0.005 |
| 964.23182 | 0.005 |
| 962.30336 | 0.005 |
| 960.3749 | 0.005 |
| 958.44643 | 0.005 |
| 956.51797 | 0.005 |
| 954.58951 | 0.005 |
| 952.66104 | 0.005 |
| 950.73258 | 0.004 |
| 948.80412 | 0.004 |
| 946.87565 | 0.004 |
| 944.94719 | 0.004 |
| 943.01872 | 0.004 |
| 941.09026 | 0.004 |
| 939.1618 | 0.004 |
| 937.23333 | 0.004 |
| 935.30487 | 0.004 |
| 933.37641 | 0.004 |
| 931.44794 | 0.004 |
| 929.51948 | 0.005 |
| 927.59102 | 0.006 |
| 925.66255 | 0.006 |
| 923.73409 | 0.006 |
| 921.80562 | 0.005 |
| 919.87716 | 0.004 |
| 917.9487 | 0.004 |
| 916.02023 | 0.004 |
| 914.09177 | 0.003 |
| 912.16331 | 0.003 |
| 910.23484 | 0.003 |
| 908.30638 | 0.003 |
| 906.37791 | 0.003 |
| 904.44945 | 0.003 |
| 902.52099 | 0.003 |
| 900.59252 | 0.002 |
| 898.66406 | 0.002 |
| 896.7356 | 0.002 |
| 894.80713 | 0.002 |
| 892.87867 | 0.002 |
| 890.95021 | 0.002 |
| 889.02174 | 0.002 |
| 887.09328 | 0.002 |
| 885.16481 | 0.002 |
| 883.23635 | 0.002 |
| 881.30789 | 0.002 |
| 879.37942 | 0.002 |
| 877.45096 | 0.002 |
| 875.5225 | 0.002 |
| 873.59403 | 0.002 |
| 871.66557 | 0.002 |
| 869.73711 | 0.003 |
| 867.80864 | 0.004 |
| 865.88018 | 0.004 |
| 863.95171 | 0.003 |
| 862.02325 | 0.003 |
| 860.09479 | 0.002 |
| 858.16632 | 0.002 |
| 856.23786 | 0.002 |
| 854.3094 | 0.001 |
| 852.38093 | 0.001 |
| 850.45247 | 0.001 |
| 848.52401 | 0.001 |
| 846.59554 | 0.001 |
| 844.66708 | 0.001 |
| 842.73861 | 0.001 |
| 840.81015 | 0.001 |
| 838.88169 | 0.001 |
| 836.95322 | 0.001 |
| 835.02476 | 0.001 |
| 833.0963 | 0.001 |
| 831.16783 | 0.001 |
| 829.23937 | 0.001 |
| 827.31091 | 0.001 |
| 825.38244 | 0.001 |
| 823.45398 | 0.001 |
| 821.52551 | 0.001 |
| 819.59705 | 0.001 |
| 817.66859 | 0.001 |
| 815.74012 | 0.001 |
| 813.81166 | 0.001 |
| 811.8832 | 0.001 |
| 809.95473 | 0.001 |
| 808.02627 | 0.001 |
| 806.09781 | 0.001 |
| 804.16934 | 0.002 |
| 802.24088 | 0.003 |
| 800.31241 | 0.006 |
| 798.38395 | 0.01 |
| 796.45549 | 0.015 |
| 794.52702 | 0.02 |
| 792.59856 | 0.026 |
| 790.6701 | 0.034 |
| 788.74163 | 0.036 |
| 786.81317 | 0.03 |
| 784.88471 | 0.021 |
| 782.95624 | 0.013 |
| 781.02778 | 0.009 |
| 779.09931 | 0.007 |
| 777.17085 | 0.009 |
| 775.24239 | 0.016 |
| 773.31392 | 0.026 |
| 771.38546 | 0.034 |
| 769.457 | 0.033 |
| 767.52853 | 0.027 |
| 765.60007 | 0.02 |
| 763.6716 | 0.015 |
| 761.74314 | 0.011 |
| 759.81468 | 0.009 |
| 757.88621 | 0.007 |
| 755.95775 | 0.006 |
| 754.02929 | 0.005 |
| 752.10082 | 0.005 |
| 750.17236 | 0.004 |
| 748.2439 | 0.004 |
| 746.31543 | 0.003 |
| 744.38697 | 0.003 |
| 742.4585 | 0.003 |
| 740.53004 | 0.002 |
| 738.60158 | 0.002 |
| 736.67311 | 0.002 |
| 734.74465 | 0.002 |
| 732.81619 | 0.002 |
| 730.88772 | 0.001 |
| 728.95926 | 0.001 |
| 727.0308 | 0.001 |
| 725.10233 | 0.001 |
| 723.17387 | 0.001 |
| 721.2454 | 0.001 |
| 719.31694 | 0.001 |
| 717.38848 | 0.001 |
| 715.46001 | 0 |
| 713.53155 | 0 |
| 711.60309 | 0 |
| 709.67462 | 0 |
| 707.74616 | 0 |
| 705.8177 | 0 |
| 703.88923 | 0 |
| 701.96077 | 0 |
| 700.0323 | 0 |
| 698.10384 | 0 |
| 696.17538 | 0 |
| 694.24691 | 0 |
| 692.31845 | 0 |
| 690.38999 | 0 |
| 688.46152 | 0 |
| 686.53306 | 0.001 |
| 684.6046 | 0.002 |
| 682.67613 | 0.006 |
| 680.74767 | 0.012 |
| 678.8192 | 0.019 |
| 676.89074 | 0.021 |
| 674.96228 | 0.018 |
| 673.03381 | 0.014 |
| 671.10535 | 0.012 |
| 669.17689 | 0.01 |
| 667.24842 | 0.009 |
| 665.31996 | 0.009 |
| 663.3915 | 0.01 |
| 661.46303 | 0.01 |
| 659.53457 | 0.008 |
| 657.6061 | 0.005 |
| 655.67764 | 0.004 |
| 653.74918 | 0.003 |
| 651.82071 | 0.002 |
| 649.89225 | 0.002 |
| 647.96379 | 0.002 |
| 646.03532 | 0.002 |
| 644.10686 | 0.002 |
| 642.1784 | 0.002 |
| 640.24993 | 0.002 |
| 638.32147 | 0.003 |
| 636.393 | 0.003 |
| 634.46454 | 0.004 |
| 632.53608 | 0.004 |
| 630.60761 | 0.004 |
| 628.67915 | 0.005 |
| 626.75069 | 0.006 |
| 624.82222 | 0.01 |
| 622.89376 | 0.015 |
| 620.96529 | 0.024 |
| 619.03683 | 0.033 |
| 617.10837 | 0.042 |
| 615.1799 | 0.046 |
| 613.25144 | 0.047 |
| 611.32298 | 0.044 |
| 609.39451 | 0.041 |
| 607.46605 | 0.037 |
| 605.53759 | 0.032 |
| 603.60912 | 0.027 |
| 601.68066 | 0.023 |
| 599.75219 | 0.019 |
| 597.82373 | 0.016 |
| 595.89527 | 0.014 |
| 593.9668 | 0.013 |
| 592.03834 | 0.012 |
| 590.10988 | 0.011 |
| 588.18141 | 0.011 |
| 586.25295 | 0.012 |
| 584.32449 | 0.016 |
| 582.39602 | 0.019 |
| 580.46756 | 0.018 |
| 578.53909 | 0.014 |
| 576.61063 | 0.01 |
| 574.68217 | 0.008 |
| 572.7537 | 0.007 |
| 570.82524 | 0.007 |
| 568.89678 | 0.006 |
| 566.96831 | 0.004 |
| 565.03985 | 0.004 |
| 563.11139 | 0.003 |
| 561.18292 | 0.003 |
| 559.25446 | 0.002 |
| 557.32599 | 0.002 |
| 555.39753 | 0.002 |
| 553.46907 | 0.002 |
| 551.5406 | 0.002 |
| 549.61214 | 0.002 |
| 547.68368 | 0.002 |
| 545.75521 | 0.002 |
| 543.82675 | 0.002 |
| 541.89829 | 0.002 |
| 539.96982 | 0.002 |
| 538.04136 | 0.002 |
| 536.11289 | 0.002 |
| 534.18443 | 0.002 |
| 532.25597 | 0.002 |
| 530.3275 | 0.002 |
| 528.39904 | 0.003 |
| 526.47058 | 0.004 |
| 524.54211 | 0.004 |
| 522.61365 | 0.005 |
| 520.68519 | 0.005 |
| 518.75672 | 0.007 |
| 516.82826 | 0.011 |
| 514.89979 | 0.016 |
| 512.97133 | 0.018 |
| 511.04287 | 0.015 |
| 509.1144 | 0.01 |
| 507.18594 | 0.005 |
| 505.25748 | 0.003 |
| 503.32901 | 0.002 |
| 501.40055 | 0.001 |
| 499.47209 | 0 |